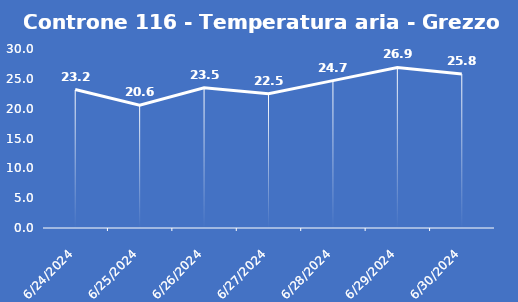
| Category | Controne 116 - Temperatura aria - Grezzo (°C) |
|---|---|
| 6/24/24 | 23.2 |
| 6/25/24 | 20.6 |
| 6/26/24 | 23.5 |
| 6/27/24 | 22.5 |
| 6/28/24 | 24.7 |
| 6/29/24 | 26.9 |
| 6/30/24 | 25.8 |